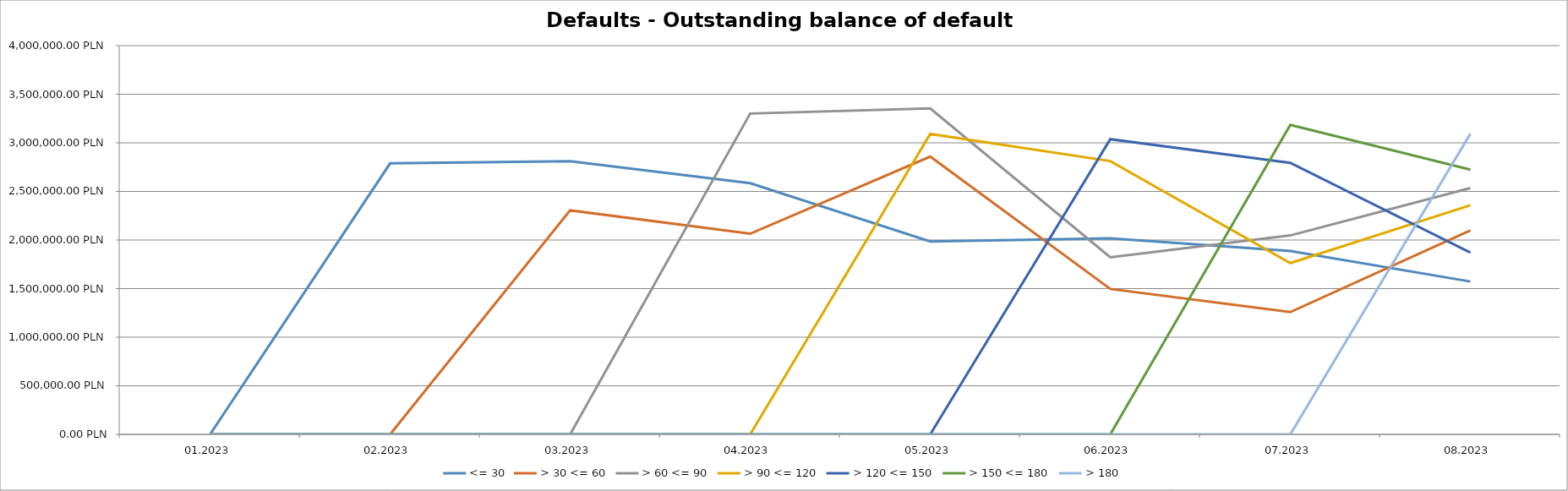
| Category | <= 30 | > 30 <= 60 | > 60 <= 90 | > 90 <= 120 | > 120 <= 150 | > 150 <= 180 | > 180 |
|---|---|---|---|---|---|---|---|
| 01.2023 | 0 | 0 | 0 | 0 | 0 | 0 | 0 |
| 02.2023 | 2788519.82 | 0 | 0 | 0 | 0 | 0 | 0 |
| 03.2023 | 2811517.14 | 2305154.07 | 0 | 0 | 0 | 0 | 0 |
| 04.2023 | 2584791.3 | 2064675.87 | 3301101.31 | 0 | 0 | 0 | 0 |
| 05.2023 | 1985441.56 | 2858398.5 | 3353485.78 | 3091988.77 | 0 | 0 | 0 |
| 06.2023 | 2016845.02 | 1496657.8 | 1822162.63 | 2812422.86 | 3037767.68 | 0 | 0 |
| 07.2023 | 1886118.05 | 1257979.4 | 2047168.21 | 1762916.26 | 2793763.11 | 3184053.47 | 0 |
| 08.2023 | 1572650.17 | 2099798.77 | 2534461.69 | 2357426.74 | 1871124.51 | 2723545.23 | 3093972.9 |